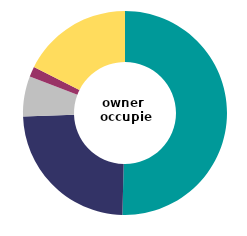
| Category | owner 
occupied |
|---|---|
| garage or car port - on plot | 50.407 |
| designated parking space - on plot | 24.058 |
| off plot designated parking | 6.373 |
| communal parking  | 1.607 |
| no designated parking provision | 17.555 |